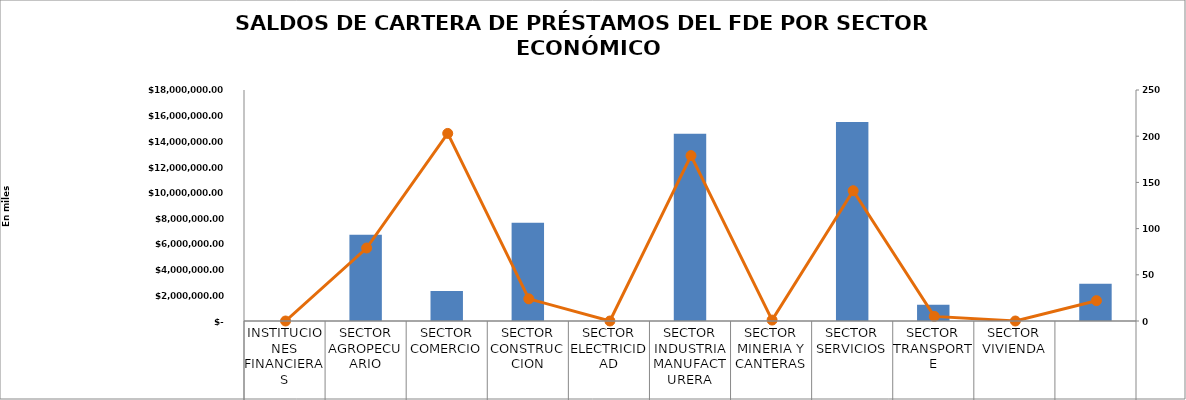
| Category |  Saldo del Crédito en Miles US$ |
|---|---|
| INSTITUCIONES FINANCIERAS | 0 |
| SECTOR AGROPECUARIO | 6725252.77 |
| SECTOR COMERCIO | 2328737.49 |
| SECTOR CONSTRUCCION | 7648754.39 |
| SECTOR ELECTRICIDAD | 0 |
| SECTOR INDUSTRIA MANUFACTURERA | 14583342.66 |
| SECTOR MINERIA Y CANTERAS | 14806.69 |
| SECTOR SERVICIOS | 15508075.57 |
| SECTOR TRANSPORTE | 1272203.74 |
| SECTOR VIVIENDA | 0 |